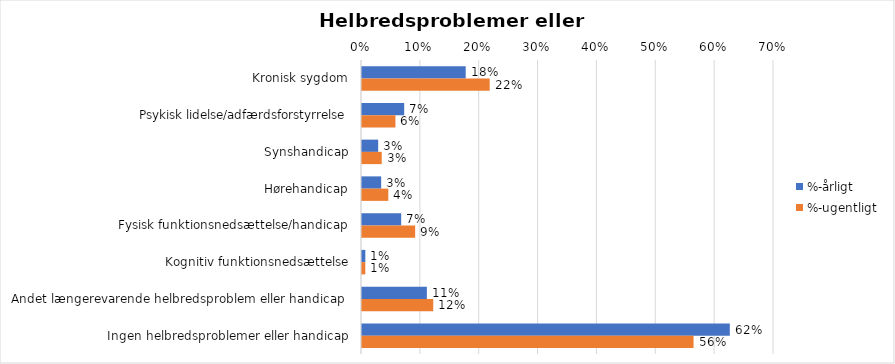
| Category | %-årligt | %-ugentligt |
|---|---|---|
| Kronisk sygdom | 0.176 | 0.217 |
| Psykisk lidelse/adfærdsforstyrrelse | 0.072 | 0.057 |
| Synshandicap | 0.027 | 0.034 |
| Hørehandicap | 0.033 | 0.045 |
| Fysisk funktionsnedsættelse/handicap | 0.067 | 0.09 |
| Kognitiv funktionsnedsættelse | 0.006 | 0.006 |
| Andet længerevarende helbredsproblem eller handicap  | 0.11 | 0.121 |
| Ingen helbredsproblemer eller handicap | 0.625 | 0.563 |